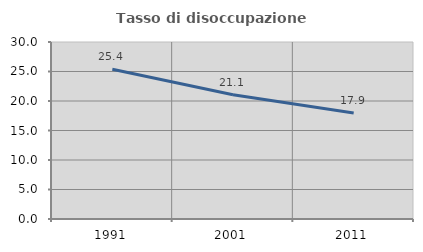
| Category | Tasso di disoccupazione giovanile  |
|---|---|
| 1991.0 | 25.392 |
| 2001.0 | 21.053 |
| 2011.0 | 17.949 |